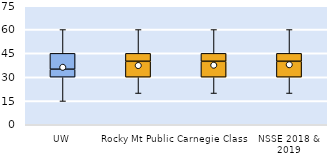
| Category | 25th | 50th | 75th |
|---|---|---|---|
| UW | 30 | 5 | 10 |
| Rocky Mt Public | 30 | 10 | 5 |
| Carnegie Class | 30 | 10 | 5 |
| NSSE 2018 & 2019 | 30 | 10 | 5 |